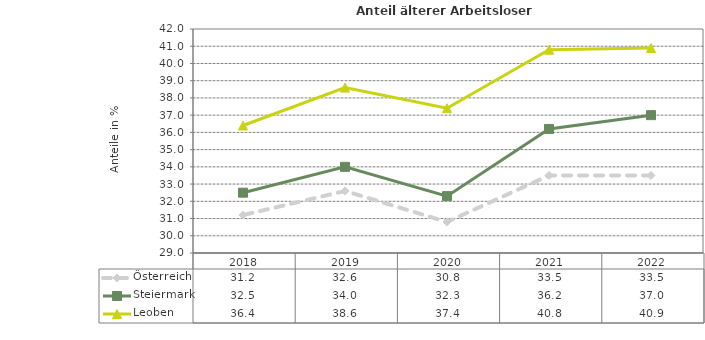
| Category | Österreich | Steiermark | Leoben |
|---|---|---|---|
| 2022.0 | 33.5 | 37 | 40.9 |
| 2021.0 | 33.5 | 36.2 | 40.8 |
| 2020.0 | 30.8 | 32.3 | 37.4 |
| 2019.0 | 32.6 | 34 | 38.6 |
| 2018.0 | 31.2 | 32.5 | 36.4 |